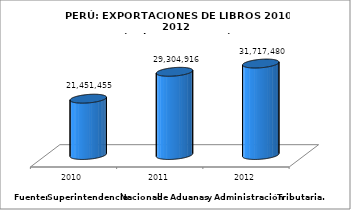
| Category | Series 1 |
|---|---|
| 2010.0 | 21451454.71 |
| 2011.0 | 29304915.86 |
| 2012.0 | 31717480.1 |